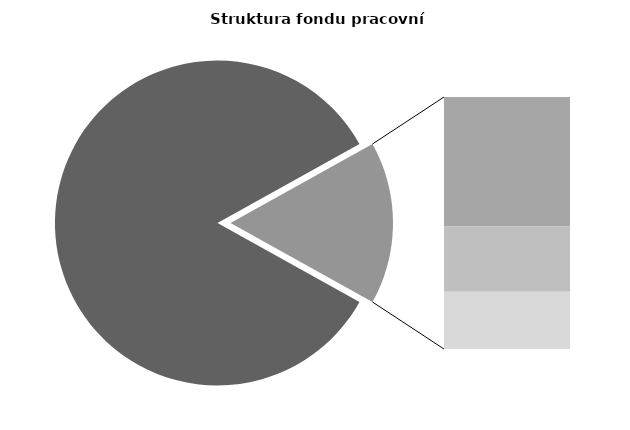
| Category | Series 0 |
|---|---|
| Průměrná měsíční odpracovaná doba bez přesčasu | 142.003 |
| Dovolená | 14.074 |
| Nemoc | 7.08 |
| Jiné | 6.228 |